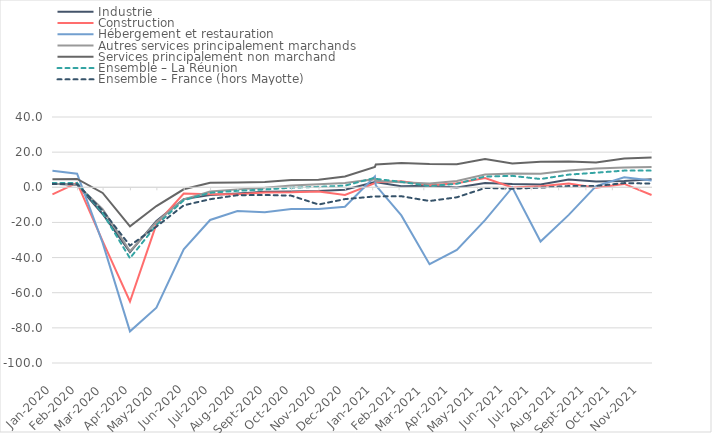
| Category | Industrie | Construction | Hébergement et restauration | Autres services principalement marchands | Services principalement non marchand | Ensemble – La Réunion | Ensemble – France (hors Mayotte) |
|---|---|---|---|---|---|---|---|
| janvier 20 | 1.964 | -4.003 | 9.406 | 2.005 | 4.519 | 2.392 | 1.889 |
| février 20 | 1.412 | 2.576 | 7.717 | 1.432 | 4.777 | 2.441 | 1.772 |
| mars 20 | -15.192 | -30.598 | -31.612 | -12.437 | -3.242 | -14.648 | -13.312 |
| avril 20 | -36.864 | -65.016 | -81.988 | -36.346 | -22.215 | -40.372 | -33.189 |
| mai 20 | -19.105 | -20.955 | -68.559 | -19.762 | -10.672 | -21.459 | -22.397 |
| juin 20 | -6.718 | -3.576 | -35.32 | -6.844 | -1.15 | -7.39 | -10.272 |
| juillet 20 | -4.429 | -3.923 | -18.611 | -2.413 | 2.558 | -3.105 | -6.786 |
| août 20 | -3.554 | -3.998 | -13.512 | -1.19 | 2.774 | -2.003 | -4.501 |
| septembre 20 | -2.573 | -3.006 | -14.148 | -0.245 | 3.025 | -1.255 | -4.385 |
| octobre 20 | -2.39 | -2.884 | -12.298 | 1.083 | 4.156 | -0.225 | -4.751 |
| novembre 20 | -2.099 | -2.372 | -12.379 | 1.727 | 4.339 | 0.25 | -9.794 |
| décembre 20 | -1.417 | -4.326 | -11.065 | 2.373 | 6.113 | 0.943 | -6.733 |
| janvier 21 | 3 | 2.4 | 6.1 | 4.6 | 11.6 | 5.4 | -5.2 |
| février 21 | 2.9 | 3 | 1.1 | 3.7 | 13 | 4.8 | -5.4 |
| mars 21 | 0.6 | 3.4 | -16 | 2.8 | 13.8 | 3.1 | -5.1 |
| avril 21 | 0.9 | 1.2 | -43.8 | 2.1 | 13.2 | 0.7 | -7.8 |
| mai 21 | -0.1 | 2.3 | -35.6 | 3.6 | 13.1 | 2 | -5.7 |
| juin 21 | 2.5 | 5.3 | -18.7 | 7.3 | 16.1 | 6.1 | -0.4 |
| juillet 21 | 1.8 | -0.1 | -0.1 | 7.9 | 13.6 | 6.5 | -0.8 |
| août 21 | 1.6 | 0.6 | -30.9 | 7.7 | 14.5 | 4.7 | -0.2 |
| septembre 21 | 4.4 | 2.1 | -15.7 | 9.5 | 14.7 | 7.2 | 0.7 |
| octobre 21 | 3.3 | -0.2 | 0.7 | 10.7 | 14.1 | 8.3 | 0.7 |
| novembre 21 | 3.6 | 1.9 | 5.7 | 11.2 | 16.4 | 9.5 | 2.4 |
| décembre 21 | 4.6 | -4.4 | 3.9 | 11.5 | 16.9 | 9.5 | 2.1 |